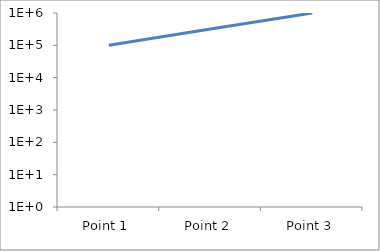
| Category | Series 2 |
|---|---|
| Point 1 | 100000 |
| Point 2 | 320000 |
| Point 3 | 1000000 |